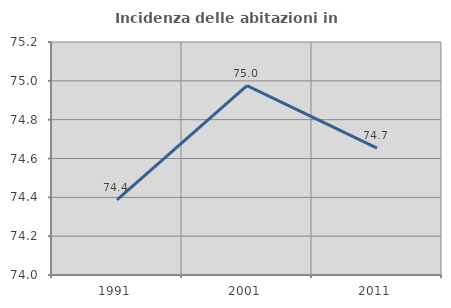
| Category | Incidenza delle abitazioni in proprietà  |
|---|---|
| 1991.0 | 74.387 |
| 2001.0 | 74.975 |
| 2011.0 | 74.653 |